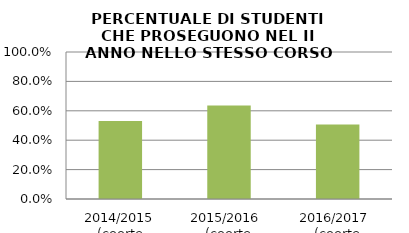
| Category | 2014/2015 (coorte 2013/14) 2015/2016  (coorte 2014/15) 2016/2017  (coorte 2015/16) |
|---|---|
| 2014/2015 (coorte 2013/14) | 0.53 |
| 2015/2016  (coorte 2014/15) | 0.635 |
| 2016/2017  (coorte 2015/16) | 0.507 |